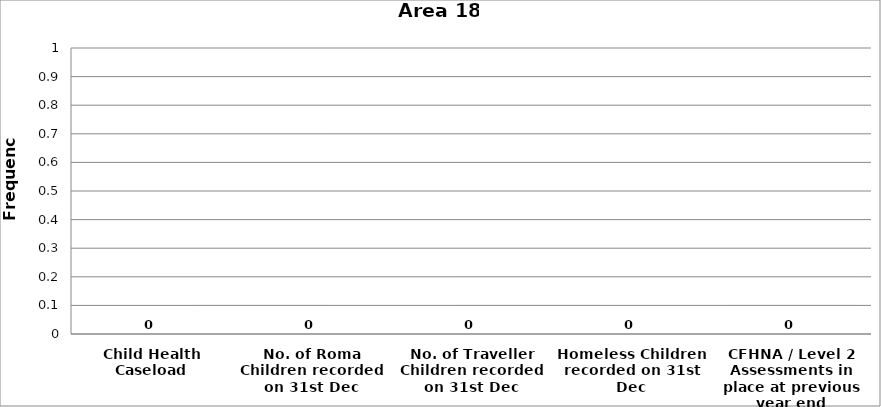
| Category | Area 18 |
|---|---|
| Child Health Caseload | 0 |
| No. of Roma Children recorded on 31st Dec | 0 |
| No. of Traveller Children recorded on 31st Dec | 0 |
| Homeless Children recorded on 31st Dec | 0 |
| CFHNA / Level 2 Assessments in place at previous year end | 0 |